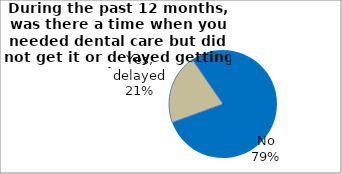
| Category | Series 0 |
|---|---|
| Yes, delayed | 20.951 |
| No | 79.049 |